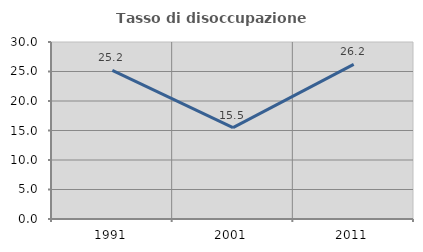
| Category | Tasso di disoccupazione giovanile  |
|---|---|
| 1991.0 | 25.187 |
| 2001.0 | 15.476 |
| 2011.0 | 26.221 |